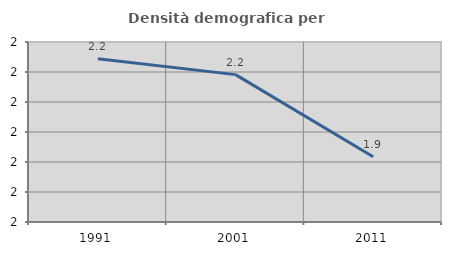
| Category | Densità demografica |
|---|---|
| 1991.0 | 2.244 |
| 2001.0 | 2.191 |
| 2011.0 | 1.917 |